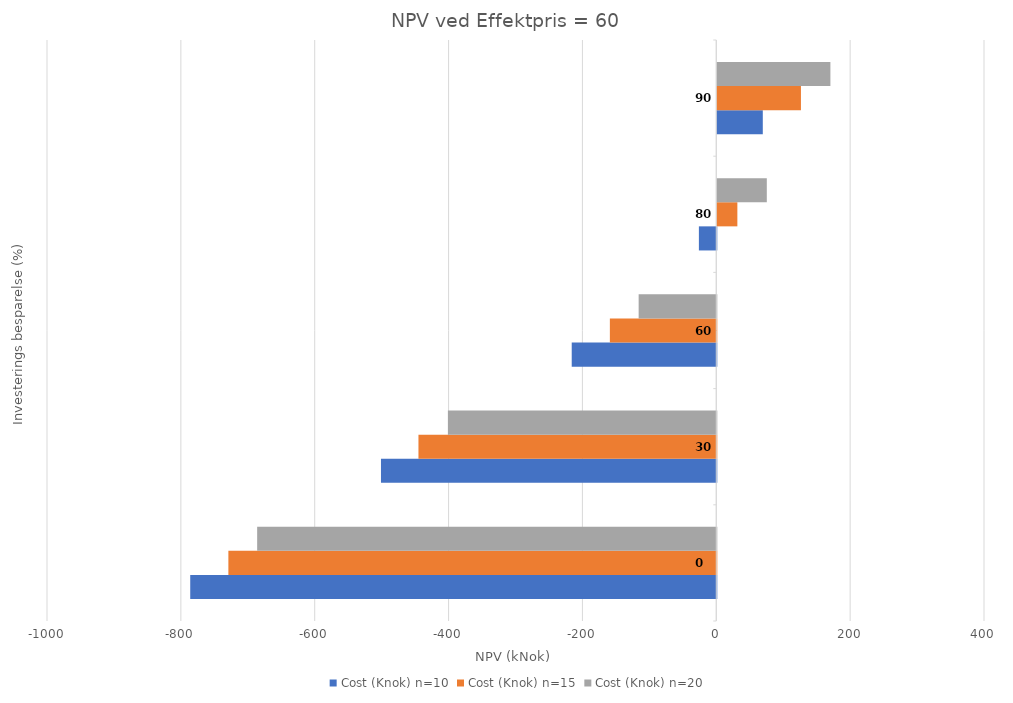
| Category | Cost (Knok) n=10 | Cost (Knok) n=15 | Cost (Knok) n=20 |
|---|---|---|---|
| 0.0 | -786 | -729 | -686 |
| 30.0 | -501 | -445 | -401 |
| 60.0 | -216 | -159 | -116 |
| 80.0 | -26 | 30 | 74 |
| 90.0 | 68 | 125 | 169 |